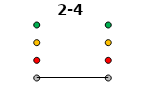
| Category | 0 | 1 | 2 | 3 | 2-4 |
|---|---|---|---|---|---|
| Time 1 | 0 | 1 | 2 | 3 | 0 |
| Time 2 | 0 | 1 | 2 | 3 | 0 |